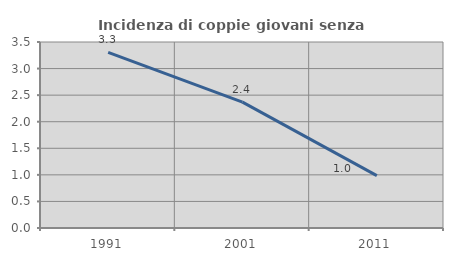
| Category | Incidenza di coppie giovani senza figli |
|---|---|
| 1991.0 | 3.304 |
| 2001.0 | 2.37 |
| 2011.0 | 0.985 |